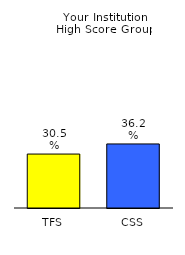
| Category | Series 0 |
|---|---|
| TFS | 0.305 |
| CSS | 0.362 |